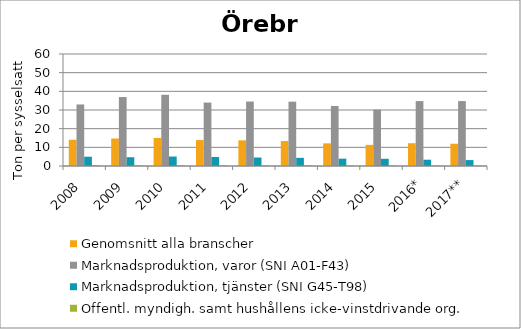
| Category | Genomsnitt alla branscher | Marknadsproduktion, varor (SNI A01-F43) | Marknadsproduktion, tjänster (SNI G45-T98) | Offentl. myndigh. samt hushållens icke-vinstdrivande org. |
|---|---|---|---|---|
| 2008 | 14.039 | 32.974 | 4.971 | 0.403 |
| 2009 | 14.736 | 36.941 | 4.701 | 0.411 |
| 2010 | 15.017 | 38.144 | 5.072 | 0.422 |
| 2011 | 13.89 | 33.981 | 4.847 | 0.409 |
| 2012 | 13.759 | 34.537 | 4.544 | 0.412 |
| 2013 | 13.367 | 34.456 | 4.369 | 0.375 |
| 2014 | 12.137 | 32.151 | 3.925 | 0.342 |
| 2015 | 11.309 | 30.208 | 3.875 | 0.313 |
| 2016* | 12.211 | 34.778 | 3.371 | 0.299 |
| 2017** | 11.925 | 34.784 | 3.172 | 0.276 |